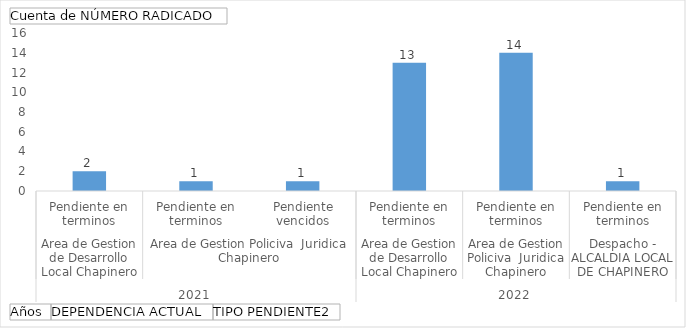
| Category | Total |
|---|---|
| 0 | 2 |
| 1 | 1 |
| 2 | 1 |
| 3 | 13 |
| 4 | 14 |
| 5 | 1 |